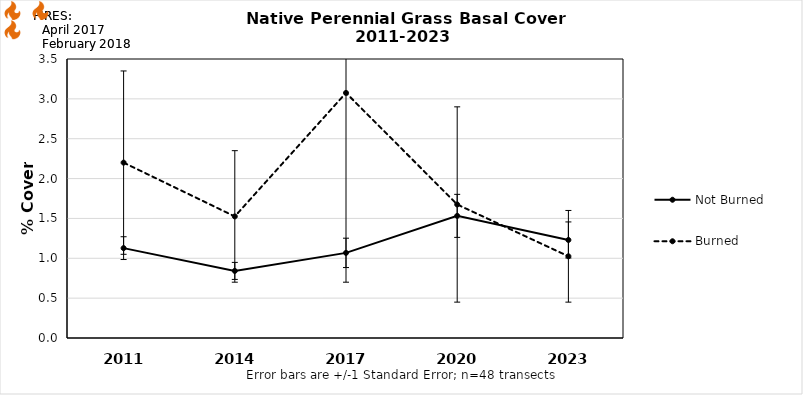
| Category | Not Burned | Burned |
|---|---|---|
| 2011.0 | 1.127 | 2.2 |
| 2014.0 | 0.842 | 1.525 |
| 2017.0 | 1.068 | 3.075 |
| 2020.0 | 1.532 | 1.675 |
| 2023.0 | 1.23 | 1.025 |